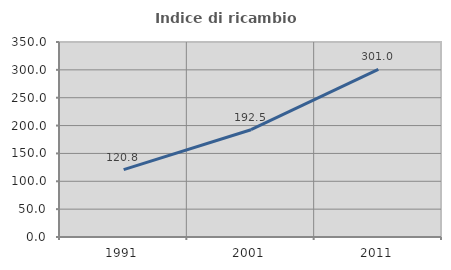
| Category | Indice di ricambio occupazionale  |
|---|---|
| 1991.0 | 120.812 |
| 2001.0 | 192.537 |
| 2011.0 | 301 |